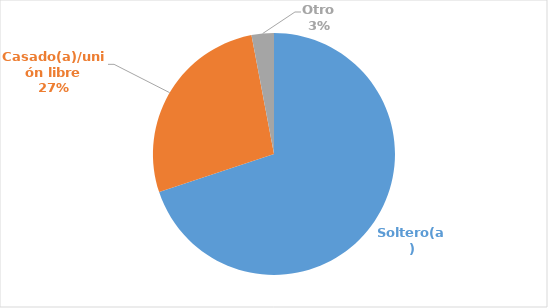
| Category | Series 0 |
|---|---|
| Soltero(a) | 0.699 |
| Casado(a)/unión libre | 0.271 |
| Otro | 0.03 |